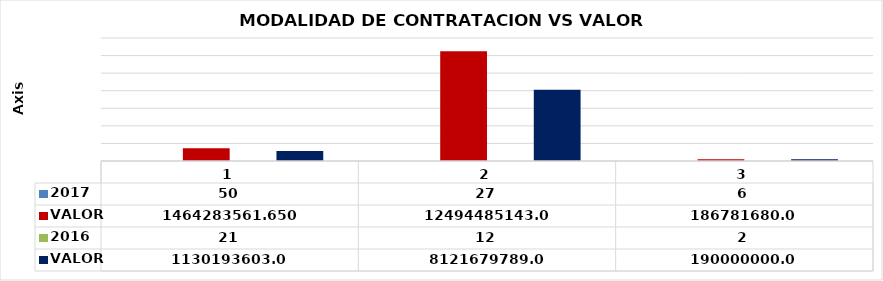
| Category | 2017 | VALOR | 2016 |
|---|---|---|---|
| 0 |  | 1130193603 |  |
| 1 |  | 8121679789 |  |
| 2 |  | 190000000 |  |